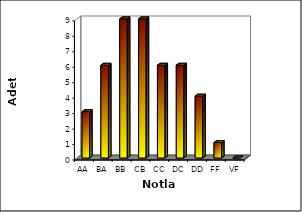
| Category | Series 0 |
|---|---|
| AA | 3 |
| BA | 6 |
| BB | 9 |
| CB | 9 |
| CC | 6 |
| DC | 6 |
| DD | 4 |
| FF | 1 |
| VF | 0 |